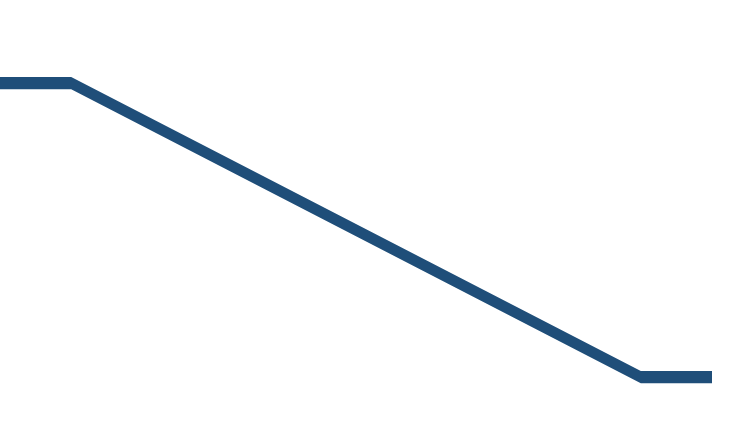
| Category | Series 0 | Series 1 | Series 2 |
|---|---|---|---|
| 0.0 | 736.933 | 116.774 | 3159.454 |
| 10.0 | 736.933 | 116.774 | 3159.454 |
| 90.0 | 3554.415 | 116.774 | 341.972 |
| 100.0 | 3554.415 | 116.774 | 341.972 |